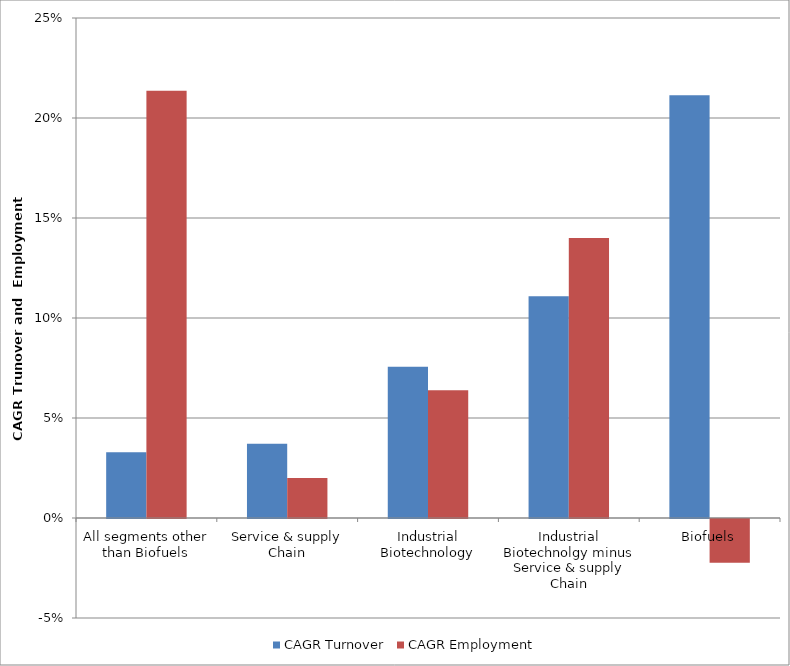
| Category | CAGR Turnover | CAGR Employment |
|---|---|---|
| All segments other than Biofuels | 0.033 | 0.214 |
| Service & supply Chain | 0.037 | 0.02 |
| Industrial Biotechnology | 0.076 | 0.064 |
| Industrial Biotechnolgy minus Service & supply Chain | 0.111 | 0.14 |
| Biofuels | 0.211 | -0.022 |